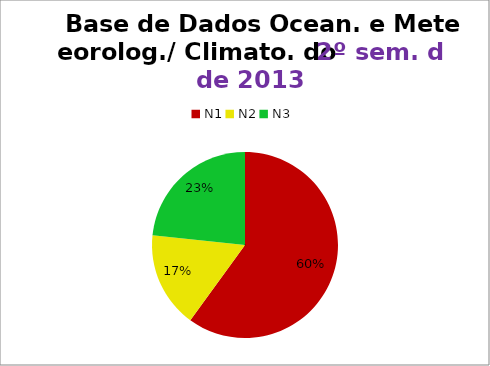
| Category | 2º/13 |
|---|---|
| N1 | 18 |
| N2 | 5 |
| N3 | 7 |